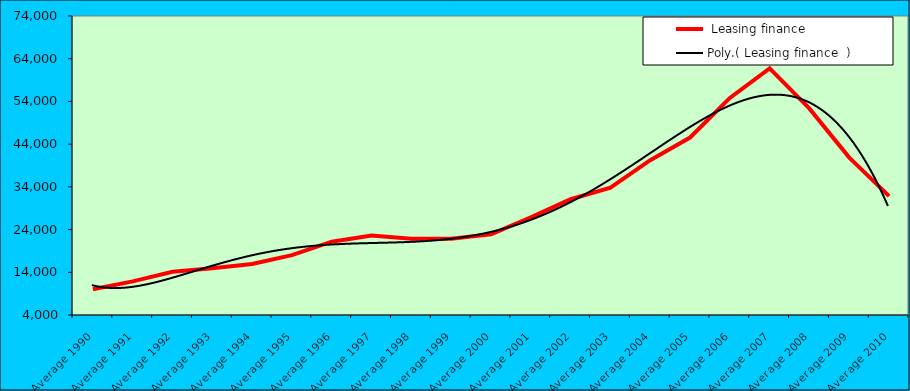
| Category |  Leasing finance   |
|---|---|
| Average 1990 | 10041.25 |
| Average 1991 | 11864.167 |
| Average 1992 | 14102.917 |
| Average 1993 | 14963.417 |
| Average 1994 | 15962.75 |
| Average 1995 | 18006.5 |
| Average 1996 | 21168.583 |
| Average 1997 | 22602 |
| Average 1998 | 21876.917 |
| Average 1999 | 21836.182 |
| Average 2000 | 22905 |
| Average 2001 | 26862.364 |
| Average 2002 | 31100.833 |
| Average 2003 | 33815.25 |
| Average 2004 | 40236.667 |
| Average 2005 | 45549.583 |
| Average 2006 | 54815.083 |
| Average 2007 | 61720.917 |
| Average 2008 | 52315 |
| Average 2009 | 40846.667 |
| Average 2010 | 31827.444 |